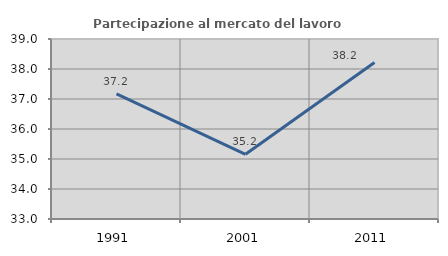
| Category | Partecipazione al mercato del lavoro  femminile |
|---|---|
| 1991.0 | 37.168 |
| 2001.0 | 35.156 |
| 2011.0 | 38.217 |